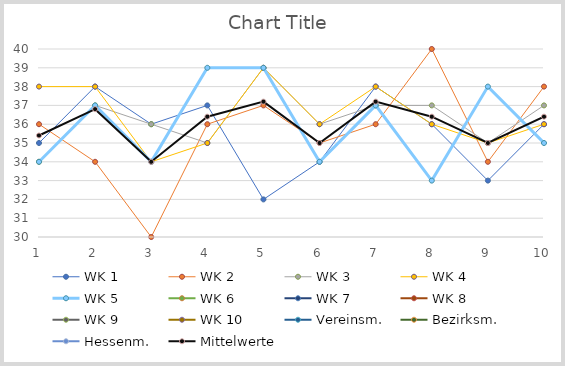
| Category | WK 1 | WK 2 | WK 3 | WK 4 | WK 5 | WK 6 | WK 7 | WK 8 | WK 9 | WK 10 | Vereinsm. | Bezirksm. | Hessenm. | Mittelwerte |
|---|---|---|---|---|---|---|---|---|---|---|---|---|---|---|
| 0 | 35 | 36 | 34 | 38 | 34 | 0 | 0 | 0 | 0 | 0 | 0 | 0 | 0 | 35.4 |
| 1 | 38 | 34 | 37 | 38 | 37 | 0 | 0 | 0 | 0 | 0 | 0 | 0 | 0 | 36.8 |
| 2 | 36 | 30 | 36 | 34 | 34 | 0 | 0 | 0 | 0 | 0 | 0 | 0 | 0 | 34 |
| 3 | 37 | 36 | 35 | 35 | 39 | 0 | 0 | 0 | 0 | 0 | 0 | 0 | 0 | 36.4 |
| 4 | 32 | 37 | 39 | 39 | 39 | 0 | 0 | 0 | 0 | 0 | 0 | 0 | 0 | 37.2 |
| 5 | 34 | 35 | 36 | 36 | 34 | 0 | 0 | 0 | 0 | 0 | 0 | 0 | 0 | 35 |
| 6 | 38 | 36 | 37 | 38 | 37 | 0 | 0 | 0 | 0 | 0 | 0 | 0 | 0 | 37.2 |
| 7 | 36 | 40 | 37 | 36 | 33 | 0 | 0 | 0 | 0 | 0 | 0 | 0 | 0 | 36.4 |
| 8 | 33 | 34 | 35 | 35 | 38 | 0 | 0 | 0 | 0 | 0 | 0 | 0 | 0 | 35 |
| 9 | 36 | 38 | 37 | 36 | 35 | 0 | 0 | 0 | 0 | 0 | 0 | 0 | 0 | 36.4 |